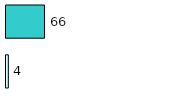
| Category | Series 0 | Series 1 |
|---|---|---|
| 0 | 4 | 66 |